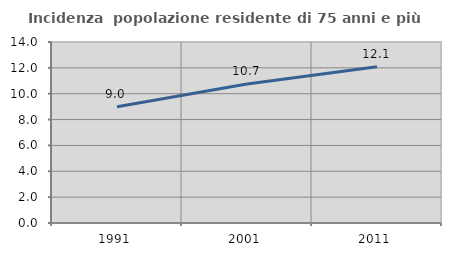
| Category | Incidenza  popolazione residente di 75 anni e più |
|---|---|
| 1991.0 | 8.986 |
| 2001.0 | 10.746 |
| 2011.0 | 12.08 |